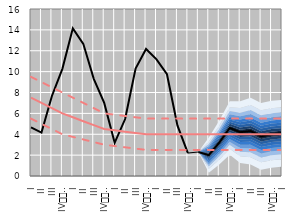
| Category | Series 5 | Series 20 | Series 21 | Series 22 |
|---|---|---|---|---|
| 0 | 4.655 | 9.5 | 5.5 | 7.5 |
| 1 | 4.16 | 9 | 5 | 7 |
| 2 | 7.669 | 8.5 | 4.5 | 6.5 |
| 3 | 10.264 | 8 | 4 | 6 |
| 4 | 14.144 | 7.5 | 3.75 | 5.625 |
| 5 | 12.664 | 7 | 3.5 | 5.25 |
| 6 | 9.311 | 6.5 | 3.25 | 4.875 |
| 7 | 7 | 6 | 3 | 4.5 |
| 8 | 3.182 | 5.875 | 2.875 | 4.375 |
| 9 | 5.456 | 5.75 | 2.75 | 4.25 |
| 10 | 10.294 | 5.625 | 2.625 | 4.125 |
| 11 | 12.172 | 5.5 | 2.5 | 4 |
| 12 | 11.176 | 5.5 | 2.5 | 4 |
| 13 | 9.75 | 5.5 | 2.5 | 4 |
| 14 | 4.853 | 5.5 | 2.5 | 4 |
| 15 | 2.2 | 5.5 | 2.5 | 4 |
| 16 | 2.3 | 5.5 | 2.5 | 4 |
| 17 | 2 | 5.5 | 2.5 | 4 |
| 18 | 3.2 | 5.5 | 2.5 | 4 |
| 19 | 4.6 | 5.5 | 2.5 | 4 |
| 20 | 4.2 | 5.5 | 2.5 | 4 |
| 21 | 4.3 | 5.5 | 2.5 | 4 |
| 22 | 3.8 | 5.5 | 2.5 | 4 |
| 23 | 4 | 5.5 | 2.5 | 4 |
| 24 | 4.1 | 5.5 | 2.5 | 4 |